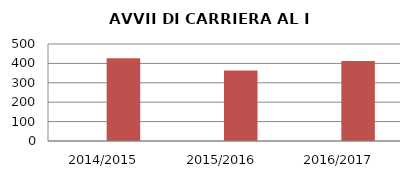
| Category | ANNO | NUMERO |
|---|---|---|
| 2014/2015 | 0 | 426 |
| 2015/2016 | 0 | 363 |
| 2016/2017 | 0 | 413 |